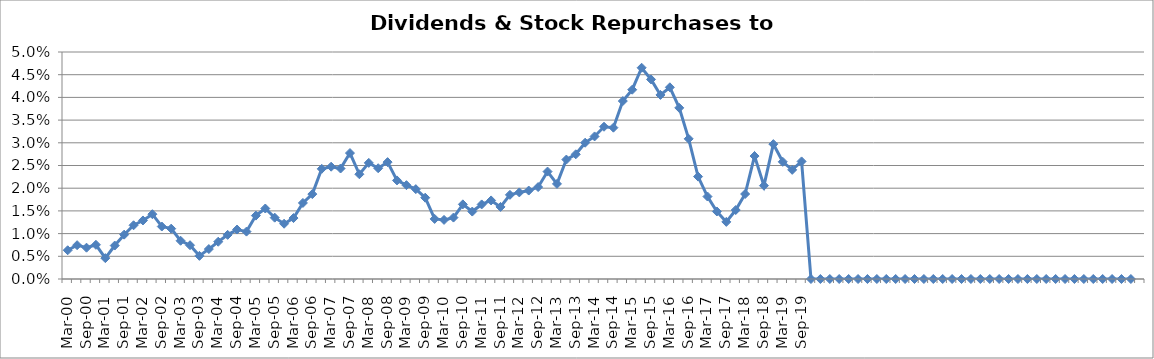
| Category | Dividends & Stock Repurchases to Revenue% |
|---|---|
| Mar-00 | 0.006 |
| Jun-00 | 0.007 |
| Sep-00 | 0.007 |
| Dec-00 | 0.008 |
| Mar-01 | 0.005 |
| Jun-01 | 0.007 |
| Sep-01 | 0.01 |
| Dec-01 | 0.012 |
| Mar-02 | 0.013 |
| Jun-02 | 0.014 |
| Sep-02 | 0.012 |
| Dec-02 | 0.011 |
| Mar-03 | 0.008 |
| Jun-03 | 0.007 |
| Sep-03 | 0.005 |
| Dec-03 | 0.007 |
| Mar-04 | 0.008 |
| Jun-04 | 0.01 |
| Sep-04 | 0.011 |
| Dec-04 | 0.01 |
| Mar-05 | 0.014 |
| Jun-05 | 0.016 |
| Sep-05 | 0.014 |
| Dec-05 | 0.012 |
| Mar-06 | 0.013 |
| Jun-06 | 0.017 |
| Sep-06 | 0.019 |
| Dec-06 | 0.024 |
| Mar-07 | 0.025 |
| Jun-07 | 0.024 |
| Sep-07 | 0.028 |
| Dec-07 | 0.023 |
| Mar-08 | 0.026 |
| Jun-08 | 0.024 |
| Sep-08 | 0.026 |
| Dec-08 | 0.022 |
| Mar-09 | 0.021 |
| Jun-09 | 0.02 |
| Sep-09 | 0.018 |
| Dec-09 | 0.013 |
| Mar-10 | 0.013 |
| Jun-10 | 0.014 |
| Sep-10 | 0.016 |
| Dec-10 | 0.015 |
| Mar-11 | 0.016 |
| Jun-11 | 0.017 |
| Sep-11 | 0.016 |
| Dec-11 | 0.019 |
| Mar-12 | 0.019 |
| Jun-12 | 0.019 |
| Sep-12 | 0.02 |
| Dec-12 | 0.024 |
| Mar-13 | 0.021 |
| Jun-13 | 0.026 |
| Sep-13 | 0.027 |
| Dec-13 | 0.03 |
| Mar-14 | 0.031 |
| Jun-14 | 0.034 |
| Sep-14 | 0.033 |
| Dec-14 | 0.039 |
| Mar-15 | 0.042 |
| Jun-15 | 0.047 |
| Sep-15 | 0.044 |
| Dec-15 | 0.041 |
| Mar-16 | 0.042 |
| Jun-16 | 0.038 |
| Sep-16 | 0.031 |
| Dec-16 | 0.023 |
| Mar-17 | 0.018 |
| Jun-17 | 0.015 |
| Sep-17 | 0.013 |
| Dec-17 | 0.015 |
| Mar-18 | 0.019 |
| Jun-18 | 0.027 |
| Sep-18 | 0.021 |
| Dec-18 | 0.03 |
| Mar-19 | 0.026 |
| Jun-19 | 0.024 |
| Sep-19 | 0.026 |